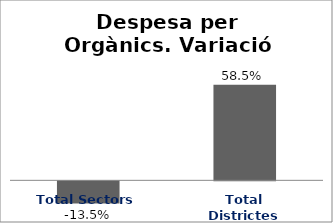
| Category | Series 0 |
|---|---|
| Total Sectors | -0.135 |
| Total Districtes | 0.585 |